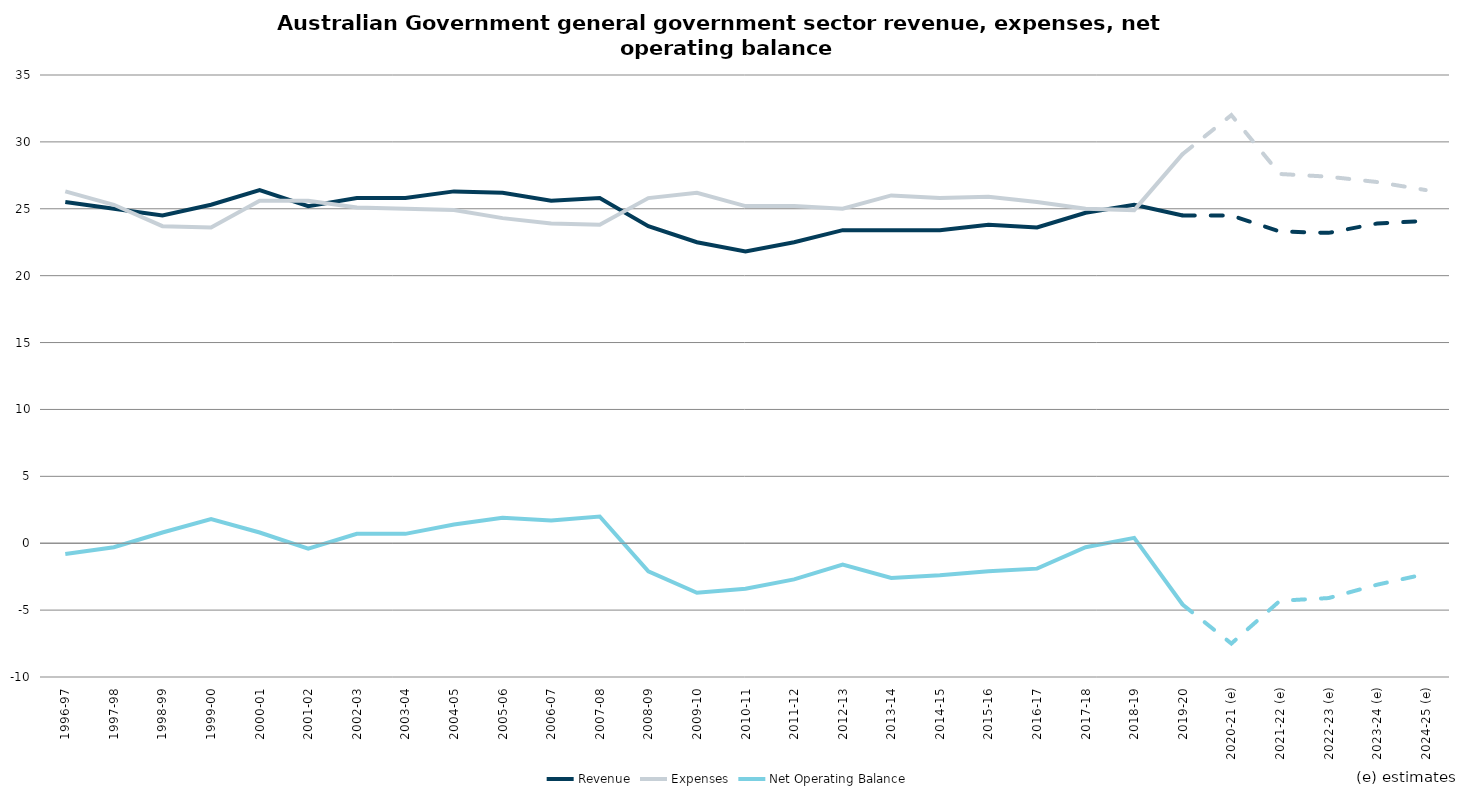
| Category | Revenue | Expenses | Net Operating Balance |
|---|---|---|---|
| 1996-97 | 25.5 | 26.3 | -0.8 |
| 1997-98 | 25 | 25.3 | -0.3 |
| 1998-99 | 24.5 | 23.7 | 0.8 |
| 1999-00 | 25.3 | 23.6 | 1.8 |
| 2000-01 | 26.4 | 25.6 | 0.8 |
| 2001-02 | 25.2 | 25.6 | -0.4 |
| 2002-03 | 25.8 | 25.1 | 0.7 |
| 2003-04 | 25.8 | 25 | 0.7 |
| 2004-05 | 26.3 | 24.9 | 1.4 |
| 2005-06 | 26.2 | 24.3 | 1.9 |
| 2006-07 | 25.6 | 23.9 | 1.7 |
| 2007-08 | 25.8 | 23.8 | 2 |
| 2008-09 | 23.7 | 25.8 | -2.1 |
| 2009-10 | 22.5 | 26.2 | -3.7 |
| 2010-11 | 21.8 | 25.2 | -3.4 |
| 2011-12 | 22.5 | 25.2 | -2.7 |
| 2012-13 | 23.4 | 25 | -1.6 |
| 2013-14 | 23.4 | 26 | -2.6 |
| 2014-15 | 23.4 | 25.8 | -2.4 |
| 2015-16 | 23.8 | 25.9 | -2.1 |
| 2016-17 | 23.6 | 25.5 | -1.9 |
| 2017-18 | 24.7 | 25 | -0.3 |
| 2018-19 | 25.3 | 24.9 | 0.4 |
| 2019-20 | 24.5 | 29.1 | -4.6 |
| 2020-21 (e) | 24.5 | 32 | -7.5 |
| 2021-22 (e) | 23.3 | 27.6 | -4.3 |
| 2022-23 (e) | 23.2 | 27.4 | -4.1 |
| 2023-24 (e) | 23.9 | 27 | -3.1 |
| 2024-25 (e) | 24.1 | 26.4 | -2.3 |